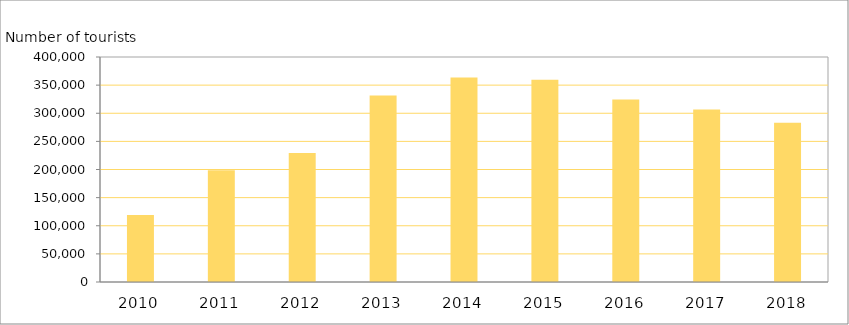
| Category | Series 0 |
|---|---|
| 2010 | 118961 |
| 2011 | 198655 |
| 2012 | 229551 |
| 2013 | 331719 |
| 2014 | 363626 |
| 2015 | 359514 |
| 2016 | 324326 |
| 2017 | 306530 |
| 2018 | 283116 |